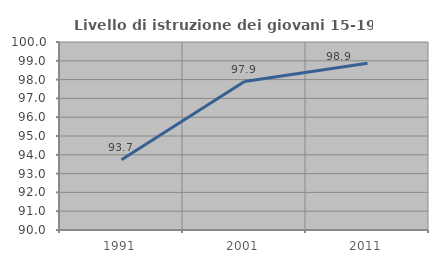
| Category | Livello di istruzione dei giovani 15-19 anni |
|---|---|
| 1991.0 | 93.738 |
| 2001.0 | 97.896 |
| 2011.0 | 98.868 |